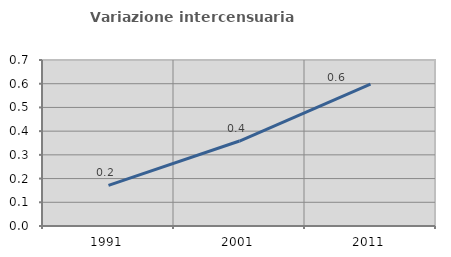
| Category | Variazione intercensuaria annua |
|---|---|
| 1991.0 | 0.171 |
| 2001.0 | 0.358 |
| 2011.0 | 0.598 |